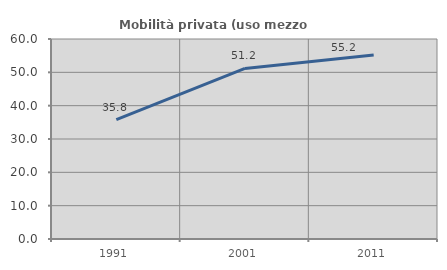
| Category | Mobilità privata (uso mezzo privato) |
|---|---|
| 1991.0 | 35.809 |
| 2001.0 | 51.157 |
| 2011.0 | 55.228 |